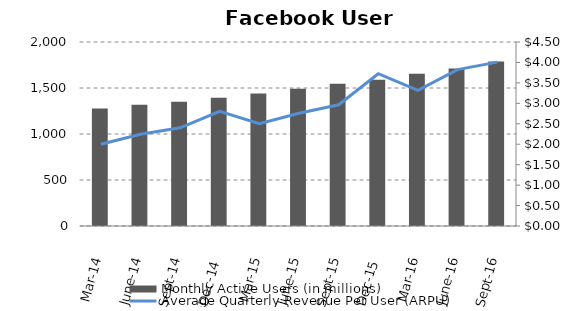
| Category | Monthly Active Users (in millions)  |
|---|---|
| Mar-14 | 1276 |
| June-14 | 1317 |
| Sept-14 | 1351 |
| Dec-14 | 1394 |
| Mar-15 | 1441 |
| June-15 | 1491 |
| Sept-15 | 1546 |
| Dec-15 | 1591 |
| Mar-16 | 1654 |
| June-16 | 1712 |
| Sept-16 | 1787 |